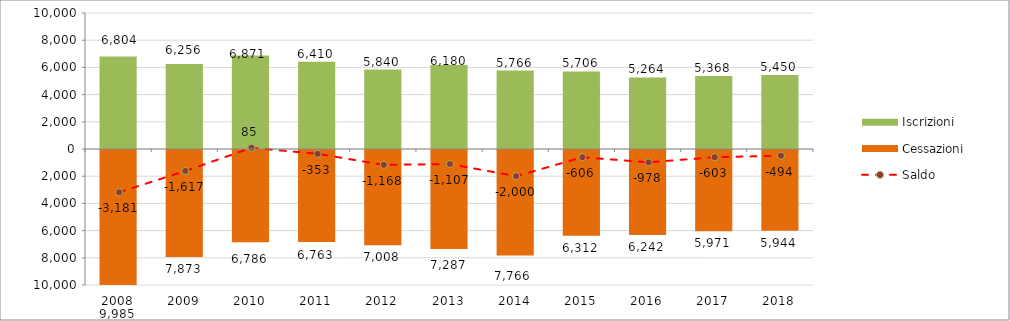
| Category | Iscrizioni | Cessazioni |
|---|---|---|
| 2008.0 | 6804 | -9985 |
| 2009.0 | 6256 | -7873 |
| 2010.0 | 6871 | -6786 |
| 2011.0 | 6410 | -6763 |
| 2012.0 | 5840 | -7008 |
| 2013.0 | 6180 | -7287 |
| 2014.0 | 5766 | -7766 |
| 2015.0 | 5706 | -6312 |
| 2016.0 | 5264 | -6242 |
| 2017.0 | 5368 | -5971 |
| 2018.0 | 5450 | -5944 |